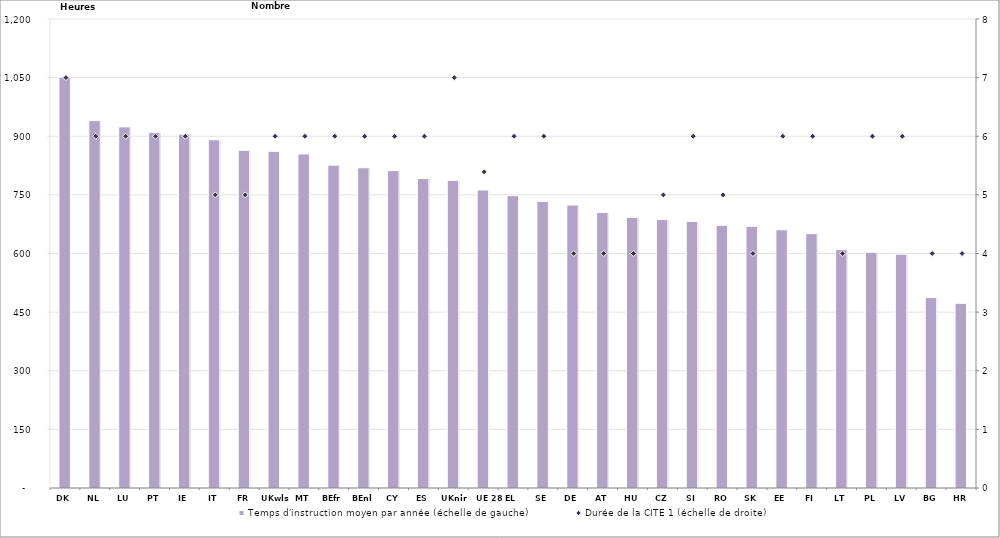
| Category | Temps d'instruction moyen par année (échelle de gauche) |
|---|---|
| DK | 1051.429 |
| NL | 940 |
| LU | 924 |
| PT | 910 |
| IE | 905 |
| IT | 891 |
| FR | 864 |
| UKwls | 861.333 |
| MT | 854.667 |
| BEfr | 826 |
| BEnl | 819.333 |
| CY | 812 |
| ES | 791.723 |
| UKnir | 787.143 |
| UE 28 | 762.41 |
| EL | 748 |
| SE | 733.333 |
| DE | 724 |
| AT | 705 |
| HU | 692.25 |
| CZ | 686.8 |
| SI | 681.875 |
| RO | 672 |
| SK | 669.5 |
| EE | 660.625 |
| FI | 650.75 |
| LT | 610.25 |
| PL | 603.167 |
| LV | 598.167 |
| BG | 487.25 |
| HR | 472.5 |